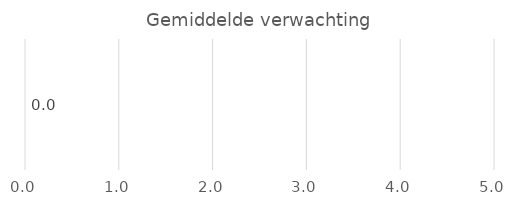
| Category | Series 0 |
|---|---|
| Verwachting | 0 |